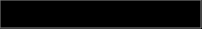
| Category | Series 0 |
|---|---|
| 0 | 0.057 |
| 1 | 0.928 |
| 2 | 0.015 |